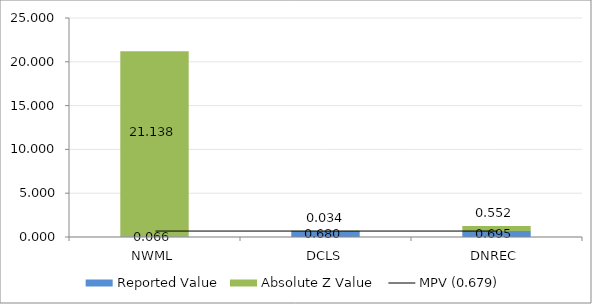
| Category | Reported Value | Absolute Z Value  |
|---|---|---|
| NWML | 0.066 | 21.138 |
| DCLS | 0.68 | 0.034 |
| DNREC | 0.695 | 0.552 |